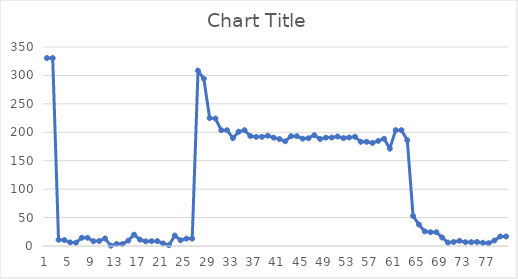
| Category | Series 0 |
|---|---|
| 0 | 330.567 |
| 1 | 330.567 |
| 2 | 10.903 |
| 3 | 10.503 |
| 4 | 6.38 |
| 5 | 5.839 |
| 6 | 14.455 |
| 7 | 14.455 |
| 8 | 8.354 |
| 9 | 8.866 |
| 10 | 13.21 |
| 11 | 0.495 |
| 12 | 3.543 |
| 13 | 3.543 |
| 14 | 9.462 |
| 15 | 19.975 |
| 16 | 11.125 |
| 17 | 8.163 |
| 18 | 8.551 |
| 19 | 8.551 |
| 20 | 4.522 |
| 21 | 1.427 |
| 22 | 18.368 |
| 23 | 10.182 |
| 24 | 12.995 |
| 25 | 12.995 |
| 26 | 308.079 |
| 27 | 294.076 |
| 28 | 225 |
| 29 | 224.182 |
| 30 | 203.613 |
| 31 | 203.613 |
| 32 | 189.84 |
| 33 | 200.976 |
| 34 | 203.711 |
| 35 | 193.359 |
| 36 | 191.976 |
| 37 | 191.976 |
| 38 | 194.068 |
| 39 | 190.626 |
| 40 | 188.084 |
| 41 | 184.166 |
| 42 | 193.234 |
| 43 | 193.234 |
| 44 | 188.768 |
| 45 | 189.586 |
| 46 | 194.969 |
| 47 | 188.272 |
| 48 | 190.662 |
| 49 | 190.662 |
| 50 | 192.621 |
| 51 | 189.773 |
| 52 | 190.838 |
| 53 | 192.2 |
| 54 | 183.288 |
| 55 | 183.288 |
| 56 | 181.311 |
| 57 | 184.764 |
| 58 | 188.61 |
| 59 | 171.318 |
| 60 | 203.75 |
| 61 | 203.75 |
| 62 | 186.096 |
| 63 | 52.8 |
| 64 | 37.694 |
| 65 | 25.76 |
| 66 | 24.209 |
| 67 | 24.209 |
| 68 | 15.027 |
| 69 | 5.996 |
| 70 | 7.109 |
| 71 | 9.214 |
| 72 | 6.791 |
| 73 | 6.791 |
| 74 | 7.103 |
| 75 | 5.753 |
| 76 | 4.959 |
| 77 | 9.703 |
| 78 | 16.757 |
| 79 | 16.757 |